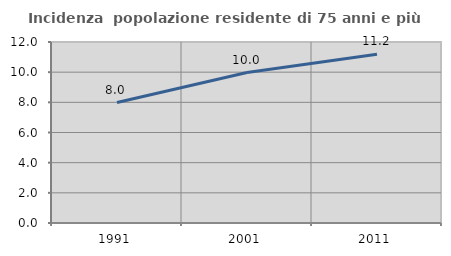
| Category | Incidenza  popolazione residente di 75 anni e più |
|---|---|
| 1991.0 | 7.986 |
| 2001.0 | 9.976 |
| 2011.0 | 11.19 |